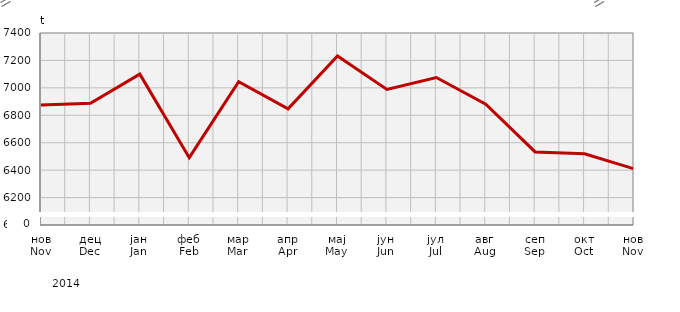
| Category | Прикупљање крављег млијека
Collecting of cow’s milk |
|---|---|
| нов
Nov | 6875.135 |
| дец
Dec | 6887.315 |
| јан
Jan | 7099.8 |
| феб
Feb | 6490.829 |
| мар
Mar | 7044.938 |
| апр
Apr | 6847.171 |
| мај
May | 7231.754 |
| јун
Jun | 6987.984 |
| јул
Jul | 7075.246 |
| авг
Aug | 6880.441 |
| сеп
Sep | 6532.974 |
| окт
Oct | 6519.778 |
| нов
Nov | 6409.6 |